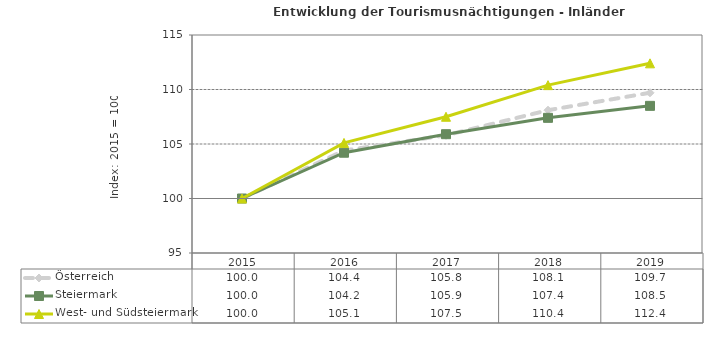
| Category | Österreich | Steiermark | West- und Südsteiermark |
|---|---|---|---|
| 2019.0 | 109.7 | 108.5 | 112.4 |
| 2018.0 | 108.1 | 107.4 | 110.4 |
| 2017.0 | 105.8 | 105.9 | 107.5 |
| 2016.0 | 104.4 | 104.2 | 105.1 |
| 2015.0 | 100 | 100 | 100 |